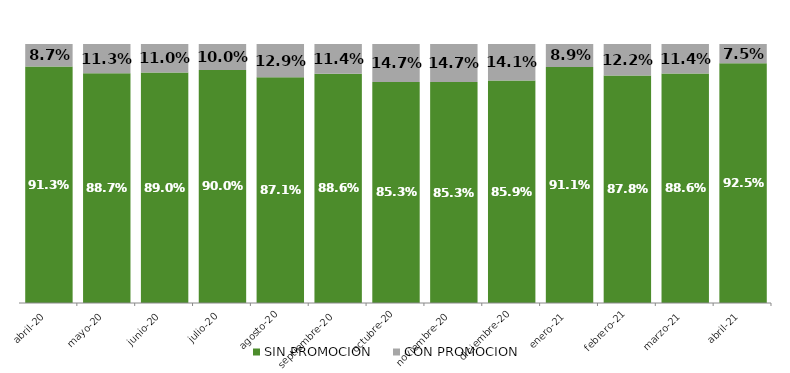
| Category | SIN PROMOCION   | CON PROMOCION   |
|---|---|---|
| 2020-04-01 | 0.913 | 0.087 |
| 2020-05-01 | 0.887 | 0.113 |
| 2020-06-01 | 0.89 | 0.11 |
| 2020-07-01 | 0.9 | 0.1 |
| 2020-08-01 | 0.871 | 0.129 |
| 2020-09-01 | 0.886 | 0.114 |
| 2020-10-01 | 0.853 | 0.147 |
| 2020-11-01 | 0.853 | 0.147 |
| 2020-12-01 | 0.859 | 0.141 |
| 2021-01-01 | 0.911 | 0.089 |
| 2021-02-01 | 0.878 | 0.122 |
| 2021-03-01 | 0.886 | 0.114 |
| 2021-04-01 | 0.925 | 0.075 |